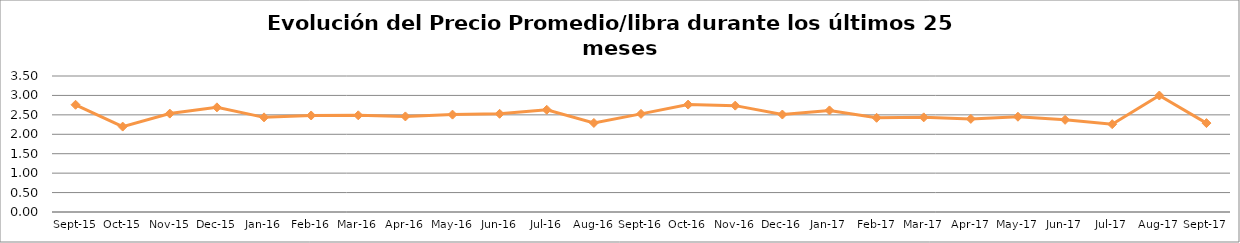
| Category | Series 0 |
|---|---|
| 2015-09-01 | 2.76 |
| 2015-10-01 | 2.198 |
| 2015-11-01 | 2.532 |
| 2015-12-01 | 2.693 |
| 2016-01-01 | 2.436 |
| 2016-02-01 | 2.484 |
| 2016-03-01 | 2.488 |
| 2016-04-01 | 2.46 |
| 2016-05-01 | 2.506 |
| 2016-06-01 | 2.527 |
| 2016-07-01 | 2.631 |
| 2016-08-01 | 2.292 |
| 2016-09-01 | 2.525 |
| 2016-10-01 | 2.764 |
| 2016-11-01 | 2.737 |
| 2016-12-01 | 2.508 |
| 2017-01-01 | 2.615 |
| 2017-02-01 | 2.424 |
| 2017-03-01 | 2.436 |
| 2017-04-01 | 2.396 |
| 2017-05-01 | 2.452 |
| 2017-06-01 | 2.372 |
| 2017-07-01 | 2.26 |
| 2017-08-01 | 2.997 |
| 2017-09-01 | 2.288 |